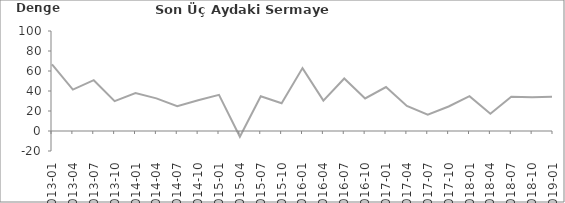
| Category | Son Üç Aydaki Sermaye Harcaması |
|---|---|
| 2013-01 | 66.6 |
| 2013-04 | 41.4 |
| 2013-07 | 50.8 |
| 2013-10 | 29.9 |
| 2014-01 | 38 |
| 2014-04 | 32.6 |
| 2014-07 | 24.8 |
| 2014-10 | 30.8 |
| 2015-01 | 36.1 |
| 2015-04 | -5.7 |
| 2015-07 | 34.7 |
| 2015-10 | 27.7 |
| 2016-01 | 62.9 |
| 2016-04 | 30.4 |
| 2016-07 | 52.5 |
| 2016-10 | 32.5 |
| 2017-01 | 44 |
| 2017-04 | 25 |
| 2017-07 | 16.3 |
| 2017-10 | 24.5 |
| 2018-01 | 34.8 |
| 2018-04 | 17.2 |
| 2018-07 | 34.3 |
| 2018-10 | 33.8 |
| 2019-01 | 34.4 |